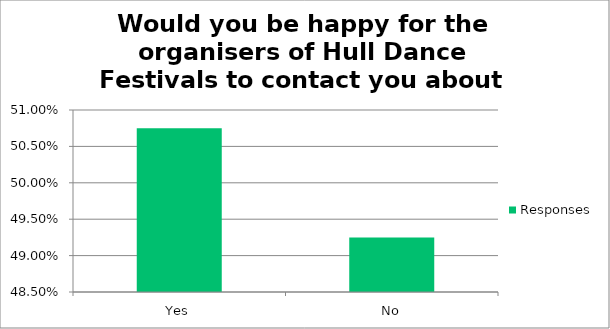
| Category | Responses |
|---|---|
| Yes | 0.507 |
| No | 0.492 |